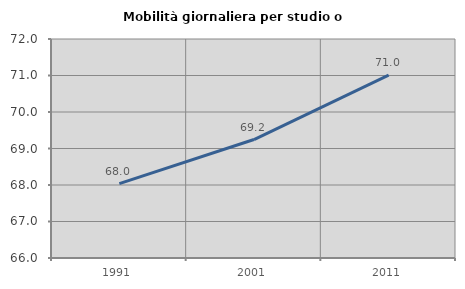
| Category | Mobilità giornaliera per studio o lavoro |
|---|---|
| 1991.0 | 68.036 |
| 2001.0 | 69.246 |
| 2011.0 | 71.009 |